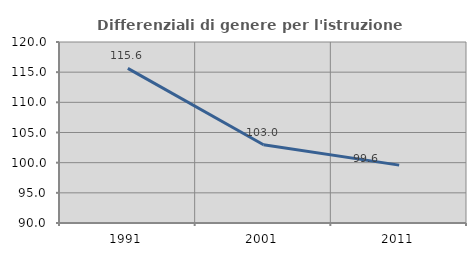
| Category | Differenziali di genere per l'istruzione superiore |
|---|---|
| 1991.0 | 115.626 |
| 2001.0 | 102.975 |
| 2011.0 | 99.594 |